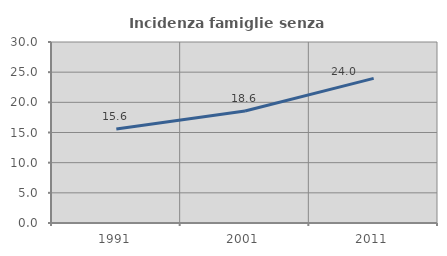
| Category | Incidenza famiglie senza nuclei |
|---|---|
| 1991.0 | 15.562 |
| 2001.0 | 18.561 |
| 2011.0 | 23.974 |